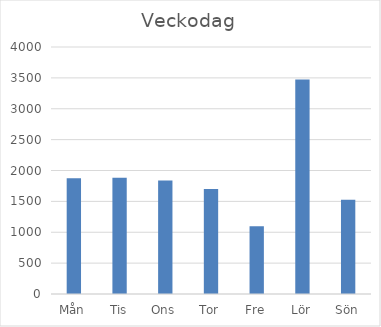
| Category | Summa |
|---|---|
| Mån | 1873 |
| Tis | 1881 |
| Ons | 1837 |
| Tor | 1702 |
| Fre | 1098 |
| Lör | 3472 |
| Sön | 1528 |